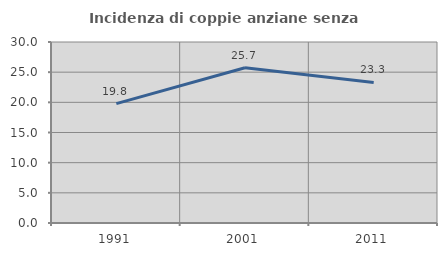
| Category | Incidenza di coppie anziane senza figli  |
|---|---|
| 1991.0 | 19.794 |
| 2001.0 | 25.731 |
| 2011.0 | 23.288 |